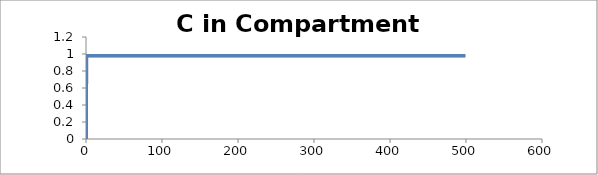
| Category | C - Sys 1 |
|---|---|
| 0.5 | 0 |
| 1.0 | 0.982 |
| 1.5 | 0.981 |
| 2.0 | 0.98 |
| 2.5 | 0.98 |
| 3.0 | 0.98 |
| 3.5 | 0.98 |
| 4.0 | 0.98 |
| 4.500000000000001 | 0.98 |
| 5.0 | 0.98 |
| 5.5 | 0.98 |
| 6.0 | 0.98 |
| 6.500000000000001 | 0.98 |
| 7.0 | 0.98 |
| 7.5 | 0.98 |
| 8.0 | 0.98 |
| 8.5 | 0.98 |
| 9.000000000000002 | 0.98 |
| 9.5 | 0.98 |
| 10.0 | 0.98 |
| 10.5 | 0.98 |
| 11.0 | 0.98 |
| 11.5 | 0.98 |
| 12.0 | 0.98 |
| 12.5 | 0.98 |
| 13.000000000000002 | 0.98 |
| 13.5 | 0.98 |
| 14.0 | 0.98 |
| 14.5 | 0.98 |
| 15.0 | 0.98 |
| 15.5 | 0.98 |
| 16.0 | 0.98 |
| 16.5 | 0.98 |
| 17.0 | 0.98 |
| 17.5 | 0.98 |
| 18.000000000000004 | 0.98 |
| 18.5 | 0.98 |
| 19.0 | 0.98 |
| 19.5 | 0.98 |
| 20.0 | 0.98 |
| 20.5 | 0.98 |
| 21.0 | 0.98 |
| 21.5 | 0.98 |
| 22.0 | 0.98 |
| 22.5 | 0.98 |
| 23.0 | 0.98 |
| 23.5 | 0.98 |
| 24.0 | 0.98 |
| 24.5 | 0.98 |
| 25.0 | 0.98 |
| 25.500000000000004 | 0.98 |
| 26.000000000000004 | 0.98 |
| 26.5 | 0.98 |
| 27.0 | 0.98 |
| 27.5 | 0.98 |
| 28.0 | 0.98 |
| 28.5 | 0.98 |
| 29.0 | 0.98 |
| 29.500000000000004 | 0.98 |
| 30.0 | 0.98 |
| 30.5 | 0.98 |
| 31.0 | 0.98 |
| 31.5 | 0.98 |
| 32.0 | 0.98 |
| 32.5 | 0.98 |
| 33.0 | 0.98 |
| 33.5 | 0.98 |
| 34.0 | 0.98 |
| 34.5 | 0.98 |
| 35.0 | 0.98 |
| 35.50000000000001 | 0.98 |
| 36.00000000000001 | 0.98 |
| 36.5 | 0.98 |
| 37.0 | 0.98 |
| 37.5 | 0.98 |
| 38.0 | 0.98 |
| 38.5 | 0.98 |
| 39.0 | 0.98 |
| 39.5 | 0.98 |
| 40.0 | 0.98 |
| 40.5 | 0.98 |
| 41.0 | 0.98 |
| 41.5 | 0.98 |
| 42.0 | 0.98 |
| 42.5 | 0.98 |
| 43.0 | 0.98 |
| 43.50000000000001 | 0.98 |
| 44.0 | 0.98 |
| 44.5 | 0.98 |
| 45.0 | 0.98 |
| 45.5 | 0.98 |
| 46.0 | 0.98 |
| 46.5 | 0.98 |
| 47.0 | 0.98 |
| 47.5 | 0.98 |
| 48.0 | 0.98 |
| 48.5 | 0.98 |
| 49.0 | 0.98 |
| 49.5 | 0.98 |
| 50.0 | 0.98 |
| 50.5 | 0.98 |
| 51.00000000000001 | 0.98 |
| 51.50000000000001 | 0.98 |
| 52.00000000000001 | 0.98 |
| 52.5 | 0.98 |
| 53.0 | 0.98 |
| 53.5 | 0.98 |
| 54.0 | 0.98 |
| 54.5 | 0.98 |
| 55.0 | 0.98 |
| 55.5 | 0.98 |
| 56.0 | 0.98 |
| 56.5 | 0.98 |
| 57.0 | 0.98 |
| 57.5 | 0.98 |
| 58.0 | 0.98 |
| 58.5 | 0.98 |
| 59.00000000000001 | 0.98 |
| 59.50000000000001 | 0.98 |
| 60.0 | 0.98 |
| 60.5 | 0.98 |
| 61.0 | 0.98 |
| 61.5 | 0.98 |
| 62.0 | 0.98 |
| 62.5 | 0.98 |
| 63.0 | 0.98 |
| 63.5 | 0.98 |
| 64.0 | 0.98 |
| 64.5 | 0.98 |
| 65.0 | 0.98 |
| 65.5 | 0.98 |
| 66.0 | 0.98 |
| 66.5 | 0.98 |
| 67.0 | 0.98 |
| 67.5 | 0.98 |
| 68.0 | 0.98 |
| 68.5 | 0.98 |
| 69.0 | 0.98 |
| 69.5 | 0.98 |
| 70.0 | 0.98 |
| 70.5 | 0.98 |
| 71.00000000000001 | 0.98 |
| 71.50000000000001 | 0.98 |
| 72.00000000000001 | 0.98 |
| 72.5 | 0.98 |
| 73.0 | 0.98 |
| 73.5 | 0.98 |
| 74.0 | 0.98 |
| 74.5 | 0.98 |
| 75.0 | 0.98 |
| 75.5 | 0.98 |
| 76.0 | 0.98 |
| 76.5 | 0.98 |
| 77.0 | 0.98 |
| 77.5 | 0.98 |
| 78.0 | 0.98 |
| 78.5 | 0.98 |
| 79.0 | 0.98 |
| 79.5 | 0.98 |
| 80.0 | 0.98 |
| 80.5 | 0.98 |
| 81.0 | 0.98 |
| 81.5 | 0.98 |
| 82.0 | 0.98 |
| 82.5 | 0.98 |
| 83.0 | 0.98 |
| 83.5 | 0.98 |
| 84.0 | 0.98 |
| 84.5 | 0.98 |
| 85.0 | 0.98 |
| 85.5 | 0.98 |
| 86.0 | 0.98 |
| 86.50000000000001 | 0.98 |
| 87.00000000000001 | 0.98 |
| 87.50000000000001 | 0.98 |
| 88.0 | 0.98 |
| 88.5 | 0.98 |
| 89.0 | 0.98 |
| 89.5 | 0.98 |
| 90.0 | 0.98 |
| 90.5 | 0.98 |
| 91.0 | 0.98 |
| 91.5 | 0.98 |
| 92.0 | 0.98 |
| 92.5 | 0.98 |
| 93.0 | 0.98 |
| 93.5 | 0.98 |
| 94.0 | 0.98 |
| 94.5 | 0.98 |
| 95.0 | 0.98 |
| 95.5 | 0.98 |
| 96.0 | 0.98 |
| 96.5 | 0.98 |
| 97.0 | 0.98 |
| 97.5 | 0.98 |
| 98.0 | 0.98 |
| 98.5 | 0.98 |
| 99.0 | 0.98 |
| 99.5 | 0.98 |
| 100.0 | 0.98 |
| 100.5 | 0.98 |
| 101.0 | 0.98 |
| 101.5 | 0.98 |
| 102.00000000000001 | 0.98 |
| 102.50000000000001 | 0.98 |
| 103.00000000000001 | 0.98 |
| 103.50000000000001 | 0.98 |
| 104.00000000000001 | 0.98 |
| 104.5 | 0.98 |
| 105.0 | 0.98 |
| 105.5 | 0.98 |
| 106.0 | 0.98 |
| 106.5 | 0.98 |
| 107.0 | 0.98 |
| 107.5 | 0.98 |
| 108.0 | 0.98 |
| 108.5 | 0.98 |
| 109.0 | 0.98 |
| 109.5 | 0.98 |
| 110.0 | 0.98 |
| 110.5 | 0.98 |
| 111.0 | 0.98 |
| 111.5 | 0.98 |
| 112.0 | 0.98 |
| 112.5 | 0.98 |
| 113.0 | 0.98 |
| 113.5 | 0.98 |
| 114.0 | 0.98 |
| 114.5 | 0.98 |
| 115.0 | 0.98 |
| 115.5 | 0.98 |
| 116.0 | 0.98 |
| 116.5 | 0.98 |
| 117.0 | 0.98 |
| 117.50000000000001 | 0.98 |
| 118.00000000000001 | 0.98 |
| 118.50000000000001 | 0.98 |
| 119.00000000000001 | 0.98 |
| 119.50000000000001 | 0.98 |
| 120.0 | 0.98 |
| 120.5 | 0.98 |
| 121.0 | 0.98 |
| 121.5 | 0.98 |
| 122.0 | 0.98 |
| 122.5 | 0.98 |
| 123.0 | 0.98 |
| 123.5 | 0.98 |
| 124.0 | 0.98 |
| 124.5 | 0.98 |
| 125.0 | 0.98 |
| 125.5 | 0.98 |
| 126.0 | 0.98 |
| 126.5 | 0.98 |
| 127.0 | 0.98 |
| 127.5 | 0.98 |
| 128.0 | 0.98 |
| 128.5 | 0.98 |
| 129.0 | 0.98 |
| 129.5 | 0.98 |
| 130.0 | 0.98 |
| 130.5 | 0.98 |
| 131.0 | 0.98 |
| 131.5 | 0.98 |
| 132.0 | 0.98 |
| 132.5 | 0.98 |
| 133.0 | 0.98 |
| 133.5 | 0.98 |
| 134.0 | 0.98 |
| 134.5 | 0.98 |
| 135.0 | 0.98 |
| 135.5 | 0.98 |
| 136.0 | 0.98 |
| 136.5 | 0.98 |
| 137.0 | 0.98 |
| 137.5 | 0.98 |
| 138.0 | 0.98 |
| 138.5 | 0.98 |
| 139.0 | 0.98 |
| 139.5 | 0.98 |
| 140.0 | 0.98 |
| 140.5 | 0.98 |
| 141.0 | 0.98 |
| 141.50000000000003 | 0.98 |
| 142.00000000000003 | 0.98 |
| 142.50000000000003 | 0.98 |
| 143.00000000000003 | 0.98 |
| 143.50000000000003 | 0.98 |
| 144.00000000000003 | 0.98 |
| 144.5 | 0.98 |
| 145.0 | 0.98 |
| 145.5 | 0.98 |
| 146.0 | 0.98 |
| 146.5 | 0.98 |
| 147.0 | 0.98 |
| 147.5 | 0.98 |
| 148.0 | 0.98 |
| 148.5 | 0.98 |
| 149.0 | 0.98 |
| 149.5 | 0.98 |
| 150.0 | 0.98 |
| 150.5 | 0.98 |
| 151.0 | 0.98 |
| 151.5 | 0.98 |
| 152.0 | 0.98 |
| 152.5 | 0.98 |
| 153.0 | 0.98 |
| 153.5 | 0.98 |
| 154.0 | 0.98 |
| 154.5 | 0.98 |
| 155.0 | 0.98 |
| 155.5 | 0.98 |
| 156.0 | 0.98 |
| 156.5 | 0.98 |
| 157.0 | 0.98 |
| 157.5 | 0.98 |
| 158.0 | 0.98 |
| 158.5 | 0.98 |
| 159.0 | 0.98 |
| 159.5 | 0.98 |
| 160.0 | 0.98 |
| 160.5 | 0.98 |
| 161.0 | 0.98 |
| 161.5 | 0.98 |
| 162.0 | 0.98 |
| 162.5 | 0.98 |
| 163.0 | 0.98 |
| 163.5 | 0.98 |
| 164.0 | 0.98 |
| 164.5 | 0.98 |
| 165.0 | 0.98 |
| 165.5 | 0.98 |
| 166.0 | 0.98 |
| 166.5 | 0.98 |
| 167.0 | 0.98 |
| 167.5 | 0.98 |
| 168.0 | 0.98 |
| 168.5 | 0.98 |
| 169.0 | 0.98 |
| 169.5 | 0.98 |
| 170.0 | 0.98 |
| 170.5 | 0.98 |
| 171.0 | 0.98 |
| 171.5 | 0.98 |
| 172.0 | 0.98 |
| 172.50000000000003 | 0.98 |
| 173.00000000000003 | 0.98 |
| 173.50000000000003 | 0.98 |
| 174.00000000000003 | 0.98 |
| 174.50000000000003 | 0.98 |
| 175.00000000000003 | 0.98 |
| 175.50000000000003 | 0.98 |
| 176.0 | 0.98 |
| 176.5 | 0.98 |
| 177.0 | 0.98 |
| 177.5 | 0.98 |
| 178.0 | 0.98 |
| 178.5 | 0.98 |
| 179.0 | 0.98 |
| 179.5 | 0.98 |
| 180.0 | 0.98 |
| 180.5 | 0.98 |
| 181.0 | 0.98 |
| 181.5 | 0.98 |
| 182.0 | 0.98 |
| 182.5 | 0.98 |
| 183.0 | 0.98 |
| 183.5 | 0.98 |
| 184.0 | 0.98 |
| 184.5 | 0.98 |
| 185.0 | 0.98 |
| 185.5 | 0.98 |
| 186.0 | 0.98 |
| 186.5 | 0.98 |
| 187.0 | 0.98 |
| 187.5 | 0.98 |
| 188.0 | 0.98 |
| 188.5 | 0.98 |
| 189.0 | 0.98 |
| 189.5 | 0.98 |
| 190.0 | 0.98 |
| 190.5 | 0.98 |
| 191.0 | 0.98 |
| 191.5 | 0.98 |
| 192.0 | 0.98 |
| 192.5 | 0.98 |
| 193.0 | 0.98 |
| 193.5 | 0.98 |
| 194.0 | 0.98 |
| 194.5 | 0.98 |
| 195.0 | 0.98 |
| 195.5 | 0.98 |
| 196.0 | 0.98 |
| 196.5 | 0.98 |
| 197.0 | 0.98 |
| 197.5 | 0.98 |
| 198.0 | 0.98 |
| 198.5 | 0.98 |
| 199.0 | 0.98 |
| 199.5 | 0.98 |
| 200.0 | 0.98 |
| 200.5 | 0.98 |
| 201.0 | 0.98 |
| 201.5 | 0.98 |
| 202.0 | 0.98 |
| 202.5 | 0.98 |
| 203.0 | 0.98 |
| 203.5 | 0.98 |
| 204.00000000000003 | 0.98 |
| 204.50000000000003 | 0.98 |
| 205.00000000000003 | 0.98 |
| 205.50000000000003 | 0.98 |
| 206.00000000000003 | 0.98 |
| 206.50000000000003 | 0.98 |
| 207.00000000000003 | 0.98 |
| 207.50000000000003 | 0.98 |
| 208.00000000000003 | 0.98 |
| 208.5 | 0.98 |
| 209.0 | 0.98 |
| 209.5 | 0.98 |
| 210.0 | 0.98 |
| 210.5 | 0.98 |
| 211.0 | 0.98 |
| 211.5 | 0.98 |
| 212.0 | 0.98 |
| 212.5 | 0.98 |
| 213.0 | 0.98 |
| 213.5 | 0.98 |
| 214.0 | 0.98 |
| 214.5 | 0.98 |
| 215.0 | 0.98 |
| 215.5 | 0.98 |
| 216.0 | 0.98 |
| 216.5 | 0.98 |
| 217.0 | 0.98 |
| 217.5 | 0.98 |
| 218.0 | 0.98 |
| 218.5 | 0.98 |
| 219.0 | 0.98 |
| 219.5 | 0.98 |
| 220.0 | 0.98 |
| 220.5 | 0.98 |
| 221.0 | 0.98 |
| 221.5 | 0.98 |
| 222.0 | 0.98 |
| 222.5 | 0.98 |
| 223.0 | 0.98 |
| 223.5 | 0.98 |
| 224.0 | 0.98 |
| 224.5 | 0.98 |
| 225.0 | 0.98 |
| 225.5 | 0.98 |
| 226.0 | 0.98 |
| 226.5 | 0.98 |
| 227.0 | 0.98 |
| 227.5 | 0.98 |
| 228.0 | 0.98 |
| 228.5 | 0.98 |
| 229.0 | 0.98 |
| 229.5 | 0.98 |
| 230.0 | 0.98 |
| 230.5 | 0.98 |
| 231.0 | 0.98 |
| 231.5 | 0.98 |
| 232.0 | 0.98 |
| 232.5 | 0.98 |
| 233.0 | 0.98 |
| 233.5 | 0.98 |
| 234.0 | 0.98 |
| 234.5 | 0.98 |
| 235.00000000000003 | 0.98 |
| 235.50000000000003 | 0.98 |
| 236.00000000000003 | 0.98 |
| 236.50000000000003 | 0.98 |
| 237.00000000000003 | 0.98 |
| 237.50000000000003 | 0.98 |
| 238.00000000000003 | 0.98 |
| 238.50000000000003 | 0.98 |
| 239.00000000000003 | 0.98 |
| 239.50000000000003 | 0.98 |
| 240.0 | 0.98 |
| 240.5 | 0.98 |
| 241.0 | 0.98 |
| 241.5 | 0.98 |
| 242.0 | 0.98 |
| 242.5 | 0.98 |
| 243.0 | 0.98 |
| 243.5 | 0.98 |
| 244.0 | 0.98 |
| 244.5 | 0.98 |
| 245.0 | 0.98 |
| 245.5 | 0.98 |
| 246.0 | 0.98 |
| 246.5 | 0.98 |
| 247.0 | 0.98 |
| 247.5 | 0.98 |
| 248.0 | 0.98 |
| 248.5 | 0.98 |
| 249.0 | 0.98 |
| 249.5 | 0.98 |
| 250.0 | 0.98 |
| 250.5 | 0.98 |
| 251.0 | 0.98 |
| 251.5 | 0.98 |
| 252.0 | 0.98 |
| 252.5 | 0.98 |
| 253.0 | 0.98 |
| 253.5 | 0.98 |
| 254.0 | 0.98 |
| 254.5 | 0.98 |
| 255.0 | 0.98 |
| 255.5 | 0.98 |
| 256.0 | 0.98 |
| 256.5 | 0.98 |
| 257.0 | 0.98 |
| 257.5 | 0.98 |
| 258.0 | 0.98 |
| 258.5 | 0.98 |
| 259.0 | 0.98 |
| 259.5 | 0.98 |
| 260.0 | 0.98 |
| 260.5 | 0.98 |
| 261.0 | 0.98 |
| 261.5 | 0.98 |
| 262.0 | 0.98 |
| 262.5 | 0.98 |
| 263.0 | 0.98 |
| 263.5 | 0.98 |
| 264.0 | 0.98 |
| 264.5 | 0.98 |
| 265.0 | 0.98 |
| 265.5 | 0.98 |
| 266.0 | 0.98 |
| 266.5 | 0.98 |
| 267.0 | 0.98 |
| 267.5 | 0.98 |
| 268.0 | 0.98 |
| 268.5 | 0.98 |
| 269.0 | 0.98 |
| 269.5 | 0.98 |
| 270.0 | 0.98 |
| 270.5 | 0.98 |
| 271.0 | 0.98 |
| 271.5 | 0.98 |
| 272.0 | 0.98 |
| 272.5 | 0.98 |
| 273.0 | 0.98 |
| 273.5 | 0.98 |
| 274.0 | 0.98 |
| 274.5 | 0.98 |
| 275.0 | 0.98 |
| 275.5 | 0.98 |
| 276.0 | 0.98 |
| 276.5 | 0.98 |
| 277.0 | 0.98 |
| 277.5 | 0.98 |
| 278.0 | 0.98 |
| 278.5 | 0.98 |
| 279.0 | 0.98 |
| 279.5 | 0.98 |
| 280.0 | 0.98 |
| 280.5 | 0.98 |
| 281.0 | 0.98 |
| 281.5 | 0.98 |
| 282.0 | 0.98 |
| 282.50000000000006 | 0.98 |
| 283.00000000000006 | 0.98 |
| 283.50000000000006 | 0.98 |
| 284.00000000000006 | 0.98 |
| 284.50000000000006 | 0.98 |
| 285.00000000000006 | 0.98 |
| 285.50000000000006 | 0.98 |
| 286.00000000000006 | 0.98 |
| 286.50000000000006 | 0.98 |
| 287.00000000000006 | 0.98 |
| 287.50000000000006 | 0.98 |
| 288.00000000000006 | 0.98 |
| 288.5 | 0.98 |
| 289.0 | 0.98 |
| 289.5 | 0.98 |
| 290.0 | 0.98 |
| 290.5 | 0.98 |
| 291.0 | 0.98 |
| 291.5 | 0.98 |
| 292.0 | 0.98 |
| 292.5 | 0.98 |
| 293.0 | 0.98 |
| 293.5 | 0.98 |
| 294.0 | 0.98 |
| 294.5 | 0.98 |
| 295.0 | 0.98 |
| 295.5 | 0.98 |
| 296.0 | 0.98 |
| 296.5 | 0.98 |
| 297.0 | 0.98 |
| 297.5 | 0.98 |
| 298.0 | 0.98 |
| 298.5 | 0.98 |
| 299.0 | 0.98 |
| 299.5 | 0.98 |
| 300.0 | 0.98 |
| 300.5 | 0.98 |
| 301.0 | 0.98 |
| 301.5 | 0.98 |
| 302.0 | 0.98 |
| 302.5 | 0.98 |
| 303.0 | 0.98 |
| 303.5 | 0.98 |
| 304.0 | 0.98 |
| 304.5 | 0.98 |
| 305.0 | 0.98 |
| 305.5 | 0.98 |
| 306.0 | 0.98 |
| 306.5 | 0.98 |
| 307.0 | 0.98 |
| 307.5 | 0.98 |
| 308.0 | 0.98 |
| 308.5 | 0.98 |
| 309.0 | 0.98 |
| 309.5 | 0.98 |
| 310.0 | 0.98 |
| 310.5 | 0.98 |
| 311.0 | 0.98 |
| 311.5 | 0.98 |
| 312.0 | 0.98 |
| 312.5 | 0.98 |
| 313.0 | 0.98 |
| 313.5 | 0.98 |
| 314.0 | 0.98 |
| 314.5 | 0.98 |
| 315.0 | 0.98 |
| 315.5 | 0.98 |
| 316.0 | 0.98 |
| 316.5 | 0.98 |
| 317.0 | 0.98 |
| 317.5 | 0.98 |
| 318.0 | 0.98 |
| 318.5 | 0.98 |
| 319.0 | 0.98 |
| 319.5 | 0.98 |
| 320.0 | 0.98 |
| 320.5 | 0.98 |
| 321.0 | 0.98 |
| 321.5 | 0.98 |
| 322.0 | 0.98 |
| 322.5 | 0.98 |
| 323.0 | 0.98 |
| 323.5 | 0.98 |
| 324.0 | 0.98 |
| 324.5 | 0.98 |
| 325.0 | 0.98 |
| 325.5 | 0.98 |
| 326.0 | 0.98 |
| 326.5 | 0.98 |
| 327.0 | 0.98 |
| 327.5 | 0.98 |
| 328.0 | 0.98 |
| 328.5 | 0.98 |
| 329.0 | 0.98 |
| 329.5 | 0.98 |
| 330.0 | 0.98 |
| 330.5 | 0.98 |
| 331.0 | 0.98 |
| 331.5 | 0.98 |
| 332.0 | 0.98 |
| 332.5 | 0.98 |
| 333.0 | 0.98 |
| 333.5 | 0.98 |
| 334.0 | 0.98 |
| 334.5 | 0.98 |
| 335.0 | 0.98 |
| 335.5 | 0.98 |
| 336.0 | 0.98 |
| 336.5 | 0.98 |
| 337.0 | 0.98 |
| 337.5 | 0.98 |
| 338.0 | 0.98 |
| 338.5 | 0.98 |
| 339.0 | 0.98 |
| 339.5 | 0.98 |
| 340.0 | 0.98 |
| 340.5 | 0.98 |
| 341.0 | 0.98 |
| 341.5 | 0.98 |
| 342.0 | 0.98 |
| 342.5 | 0.98 |
| 343.0 | 0.98 |
| 343.5 | 0.98 |
| 344.0 | 0.98 |
| 344.5 | 0.98 |
| 345.00000000000006 | 0.98 |
| 345.50000000000006 | 0.98 |
| 346.00000000000006 | 0.98 |
| 346.50000000000006 | 0.98 |
| 347.00000000000006 | 0.98 |
| 347.50000000000006 | 0.98 |
| 348.00000000000006 | 0.98 |
| 348.50000000000006 | 0.98 |
| 349.00000000000006 | 0.98 |
| 349.50000000000006 | 0.98 |
| 350.00000000000006 | 0.98 |
| 350.50000000000006 | 0.98 |
| 351.00000000000006 | 0.98 |
| 351.50000000000006 | 0.98 |
| 352.0 | 0.98 |
| 352.5 | 0.98 |
| 353.0 | 0.98 |
| 353.5 | 0.98 |
| 354.0 | 0.98 |
| 354.5 | 0.98 |
| 355.0 | 0.98 |
| 355.5 | 0.98 |
| 356.0 | 0.98 |
| 356.5 | 0.98 |
| 357.0 | 0.98 |
| 357.5 | 0.98 |
| 358.0 | 0.98 |
| 358.5 | 0.98 |
| 359.0 | 0.98 |
| 359.5 | 0.98 |
| 360.0 | 0.98 |
| 360.5 | 0.98 |
| 361.0 | 0.98 |
| 361.5 | 0.98 |
| 362.0 | 0.98 |
| 362.5 | 0.98 |
| 363.0 | 0.98 |
| 363.5 | 0.98 |
| 364.0 | 0.98 |
| 364.5 | 0.98 |
| 365.0 | 0.98 |
| 365.5 | 0.98 |
| 366.0 | 0.98 |
| 366.5 | 0.98 |
| 367.0 | 0.98 |
| 367.5 | 0.98 |
| 368.0 | 0.98 |
| 368.5 | 0.98 |
| 369.0 | 0.98 |
| 369.5 | 0.98 |
| 370.0 | 0.98 |
| 370.5 | 0.98 |
| 371.0 | 0.98 |
| 371.5 | 0.98 |
| 372.0 | 0.98 |
| 372.5 | 0.98 |
| 373.0 | 0.98 |
| 373.5 | 0.98 |
| 374.0 | 0.98 |
| 374.5 | 0.98 |
| 375.0 | 0.98 |
| 375.5 | 0.98 |
| 376.0 | 0.98 |
| 376.5 | 0.98 |
| 377.0 | 0.98 |
| 377.5 | 0.98 |
| 378.0 | 0.98 |
| 378.5 | 0.98 |
| 379.0 | 0.98 |
| 379.5 | 0.98 |
| 380.0 | 0.98 |
| 380.5 | 0.98 |
| 381.0 | 0.98 |
| 381.5 | 0.98 |
| 382.0 | 0.98 |
| 382.5 | 0.98 |
| 383.0 | 0.98 |
| 383.5 | 0.98 |
| 384.0 | 0.98 |
| 384.5 | 0.98 |
| 385.0 | 0.98 |
| 385.5 | 0.98 |
| 386.0 | 0.98 |
| 386.5 | 0.98 |
| 387.0 | 0.98 |
| 387.5 | 0.98 |
| 388.0 | 0.98 |
| 388.5 | 0.98 |
| 389.0 | 0.98 |
| 389.5 | 0.98 |
| 390.0 | 0.98 |
| 390.5 | 0.98 |
| 391.0 | 0.98 |
| 391.5 | 0.98 |
| 392.0 | 0.98 |
| 392.5 | 0.98 |
| 393.0 | 0.98 |
| 393.5 | 0.98 |
| 394.0 | 0.98 |
| 394.5 | 0.98 |
| 395.0 | 0.98 |
| 395.5 | 0.98 |
| 396.0 | 0.98 |
| 396.5 | 0.98 |
| 397.0 | 0.98 |
| 397.5 | 0.98 |
| 398.0 | 0.98 |
| 398.5 | 0.98 |
| 399.0 | 0.98 |
| 399.5 | 0.98 |
| 400.0 | 0.98 |
| 400.5 | 0.98 |
| 401.0 | 0.98 |
| 401.5 | 0.98 |
| 402.0 | 0.98 |
| 402.5 | 0.98 |
| 403.0 | 0.98 |
| 403.5 | 0.98 |
| 404.0 | 0.98 |
| 404.5 | 0.98 |
| 405.0 | 0.98 |
| 405.5 | 0.98 |
| 406.0 | 0.98 |
| 406.5 | 0.98 |
| 407.0 | 0.98 |
| 407.50000000000006 | 0.98 |
| 408.00000000000006 | 0.98 |
| 408.50000000000006 | 0.98 |
| 409.00000000000006 | 0.98 |
| 409.50000000000006 | 0.98 |
| 410.00000000000006 | 0.98 |
| 410.50000000000006 | 0.98 |
| 411.00000000000006 | 0.98 |
| 411.50000000000006 | 0.98 |
| 412.00000000000006 | 0.98 |
| 412.50000000000006 | 0.98 |
| 413.00000000000006 | 0.98 |
| 413.50000000000006 | 0.98 |
| 414.00000000000006 | 0.98 |
| 414.50000000000006 | 0.98 |
| 415.00000000000006 | 0.98 |
| 415.50000000000006 | 0.98 |
| 416.00000000000006 | 0.98 |
| 416.5 | 0.98 |
| 417.0 | 0.98 |
| 417.5 | 0.98 |
| 418.0 | 0.98 |
| 418.5 | 0.98 |
| 419.0 | 0.98 |
| 419.5 | 0.98 |
| 420.0 | 0.98 |
| 420.5 | 0.98 |
| 421.0 | 0.98 |
| 421.5 | 0.98 |
| 422.0 | 0.98 |
| 422.5 | 0.98 |
| 423.0 | 0.98 |
| 423.5 | 0.98 |
| 424.0 | 0.98 |
| 424.5 | 0.98 |
| 425.0 | 0.98 |
| 425.5 | 0.98 |
| 426.0 | 0.98 |
| 426.5 | 0.98 |
| 427.0 | 0.98 |
| 427.5 | 0.98 |
| 428.0 | 0.98 |
| 428.5 | 0.98 |
| 429.0 | 0.98 |
| 429.5 | 0.98 |
| 430.0 | 0.98 |
| 430.5 | 0.98 |
| 431.0 | 0.98 |
| 431.5 | 0.98 |
| 432.0 | 0.98 |
| 432.5 | 0.98 |
| 433.0 | 0.98 |
| 433.5 | 0.98 |
| 434.0 | 0.98 |
| 434.5 | 0.98 |
| 435.0 | 0.98 |
| 435.5 | 0.98 |
| 436.0 | 0.98 |
| 436.5 | 0.98 |
| 437.0 | 0.98 |
| 437.5 | 0.98 |
| 438.0 | 0.98 |
| 438.5 | 0.98 |
| 439.0 | 0.98 |
| 439.5 | 0.98 |
| 440.0 | 0.98 |
| 440.5 | 0.98 |
| 441.0 | 0.98 |
| 441.5 | 0.98 |
| 442.0 | 0.98 |
| 442.5 | 0.98 |
| 443.0 | 0.98 |
| 443.5 | 0.98 |
| 444.0 | 0.98 |
| 444.5 | 0.98 |
| 445.0 | 0.98 |
| 445.5 | 0.98 |
| 446.0 | 0.98 |
| 446.5 | 0.98 |
| 447.0 | 0.98 |
| 447.5 | 0.98 |
| 448.0 | 0.98 |
| 448.5 | 0.98 |
| 449.0 | 0.98 |
| 449.5 | 0.98 |
| 450.0 | 0.98 |
| 450.5 | 0.98 |
| 451.0 | 0.98 |
| 451.5 | 0.98 |
| 452.0 | 0.98 |
| 452.5 | 0.98 |
| 453.0 | 0.98 |
| 453.5 | 0.98 |
| 454.0 | 0.98 |
| 454.5 | 0.98 |
| 455.0 | 0.98 |
| 455.5 | 0.98 |
| 456.0 | 0.98 |
| 456.5 | 0.98 |
| 457.0 | 0.98 |
| 457.5 | 0.98 |
| 458.0 | 0.98 |
| 458.5 | 0.98 |
| 459.0 | 0.98 |
| 459.5 | 0.98 |
| 460.0 | 0.98 |
| 460.5 | 0.98 |
| 461.0 | 0.98 |
| 461.5 | 0.98 |
| 462.0 | 0.98 |
| 462.5 | 0.98 |
| 463.0 | 0.98 |
| 463.5 | 0.98 |
| 464.0 | 0.98 |
| 464.5 | 0.98 |
| 465.0 | 0.98 |
| 465.5 | 0.98 |
| 466.0 | 0.98 |
| 466.5 | 0.98 |
| 467.0 | 0.98 |
| 467.5 | 0.98 |
| 468.0 | 0.98 |
| 468.5 | 0.98 |
| 469.0 | 0.98 |
| 469.5 | 0.98 |
| 470.00000000000006 | 0.98 |
| 470.50000000000006 | 0.98 |
| 471.00000000000006 | 0.98 |
| 471.50000000000006 | 0.98 |
| 472.00000000000006 | 0.98 |
| 472.50000000000006 | 0.98 |
| 473.00000000000006 | 0.98 |
| 473.50000000000006 | 0.98 |
| 474.00000000000006 | 0.98 |
| 474.50000000000006 | 0.98 |
| 475.00000000000006 | 0.98 |
| 475.50000000000006 | 0.98 |
| 476.00000000000006 | 0.98 |
| 476.50000000000006 | 0.98 |
| 477.00000000000006 | 0.98 |
| 477.50000000000006 | 0.98 |
| 478.00000000000006 | 0.98 |
| 478.50000000000006 | 0.98 |
| 479.00000000000006 | 0.98 |
| 479.50000000000006 | 0.98 |
| 480.0 | 0.98 |
| 480.5 | 0.98 |
| 481.0 | 0.98 |
| 481.5 | 0.98 |
| 482.0 | 0.98 |
| 482.5 | 0.98 |
| 483.0 | 0.98 |
| 483.5 | 0.98 |
| 484.0 | 0.98 |
| 484.5 | 0.98 |
| 485.0 | 0.98 |
| 485.5 | 0.98 |
| 486.0 | 0.98 |
| 486.5 | 0.98 |
| 487.0 | 0.98 |
| 487.5 | 0.98 |
| 488.0 | 0.98 |
| 488.5 | 0.98 |
| 489.0 | 0.98 |
| 489.5 | 0.98 |
| 490.0 | 0.98 |
| 490.5 | 0.98 |
| 491.0 | 0.98 |
| 491.5 | 0.98 |
| 492.0 | 0.98 |
| 492.5 | 0.98 |
| 493.0 | 0.98 |
| 493.5 | 0.98 |
| 494.0 | 0.98 |
| 494.5 | 0.98 |
| 495.0 | 0.98 |
| 495.5 | 0.98 |
| 496.0 | 0.98 |
| 496.5 | 0.98 |
| 497.0 | 0.98 |
| 497.5 | 0.98 |
| 498.0 | 0.98 |
| 498.5 | 0.98 |
| 499.0 | 0.98 |
| 499.5 | 0.98 |
| 500.0 | 0.98 |